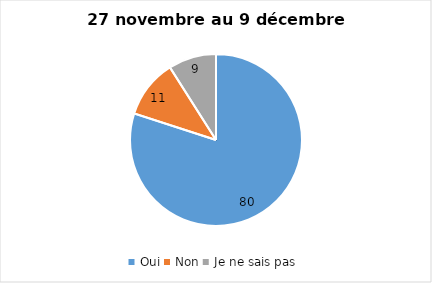
| Category | Series 0 |
|---|---|
| Oui | 80 |
| Non | 11 |
| Je ne sais pas | 9 |